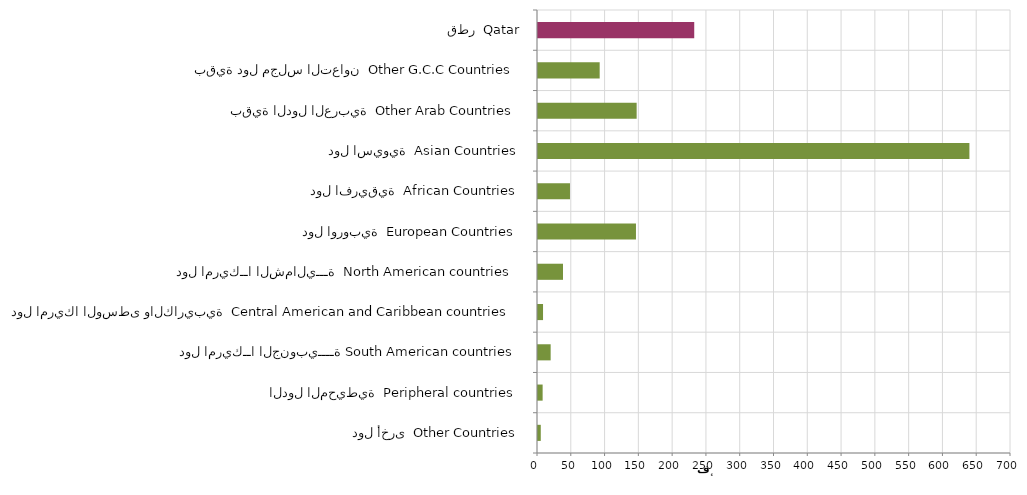
| Category | Series 0 |
|---|---|
| دول أخرى  Other Countries | 4104 |
| الدول المحيطية  Peripheral countries | 6857 |
| دول امريكــا الجنوبيــــة South American countries | 18738 |
| دول امريكا الوسطى والكاريبية  Central American and Caribbean countries | 7452 |
| دول امريكــا الشماليـــة  North American countries  | 37030 |
| دول اوروبية  European Countries | 144988 |
| دول افريقية  African Countries | 47342 |
| دول اسيوية  Asian Countries | 638467 |
| بقية الدول العربية  Other Arab Countries | 146003 |
| بقية دول مجلس التعاون  Other G.C.C Countries | 91281 |
| قطر  Qatar | 231208 |